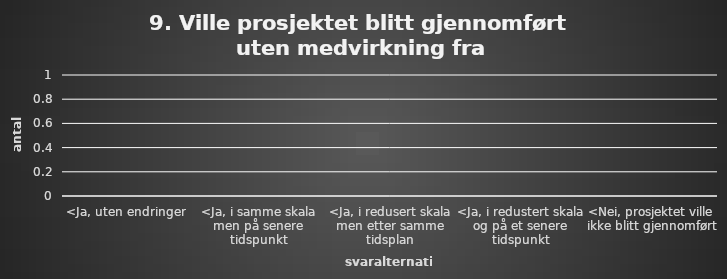
| Category | Series 0 |
|---|---|
| <Ja, uten endringer | 0 |
| <Ja, i samme skala men på senere tidspunkt | 0 |
| <Ja, i redusert skala men etter samme tidsplan | 0 |
| <Ja, i redustert skala og på et senere tidspunkt | 0 |
| <Nei, prosjektet ville ikke blitt gjennomført | 0 |